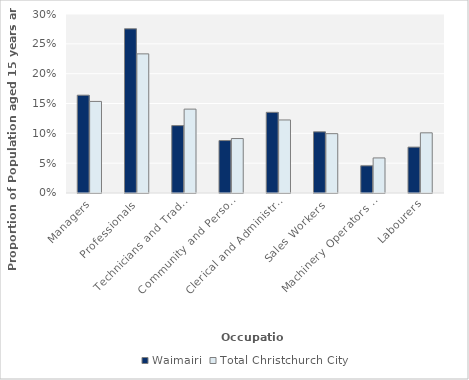
| Category | Waimairi | Total Christchurch City |
|---|---|---|
| Managers | 0.164 | 0.153 |
| Professionals | 0.275 | 0.233 |
| Technicians and Trades Workers | 0.113 | 0.141 |
| Community and Personal Service Workers | 0.088 | 0.091 |
| Clerical and Administrative Workers | 0.135 | 0.122 |
| Sales Workers | 0.103 | 0.099 |
| Machinery Operators and Drivers | 0.046 | 0.059 |
| Labourers | 0.077 | 0.101 |